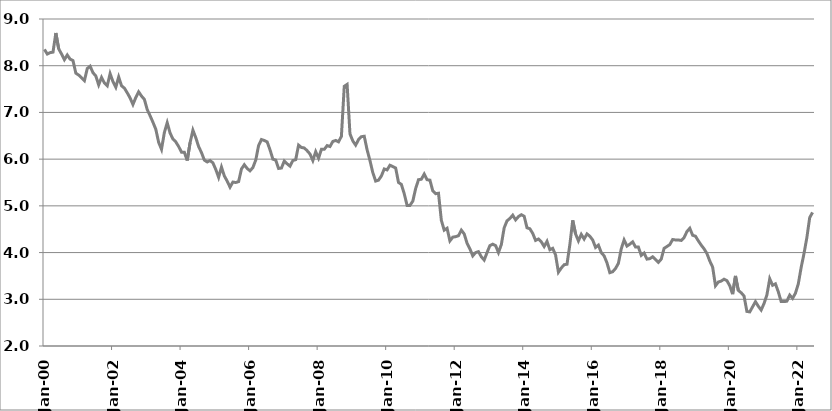
| Category | Series 1 |
|---|---|
| 2000-01-01 | 8.35 |
| 2000-02-01 | 8.25 |
| 2000-03-01 | 8.28 |
| 2000-04-01 | 8.29 |
| 2000-05-01 | 8.7 |
| 2000-06-01 | 8.36 |
| 2000-07-01 | 8.25 |
| 2000-08-01 | 8.13 |
| 2000-09-01 | 8.23 |
| 2000-10-01 | 8.14 |
| 2000-11-01 | 8.11 |
| 2000-12-01 | 7.84 |
| 2001-01-01 | 7.8 |
| 2001-02-01 | 7.74 |
| 2001-03-01 | 7.68 |
| 2001-04-01 | 7.94 |
| 2001-05-01 | 7.99 |
| 2001-06-01 | 7.85 |
| 2001-07-01 | 7.78 |
| 2001-08-01 | 7.59 |
| 2001-09-01 | 7.75 |
| 2001-10-01 | 7.63 |
| 2001-11-01 | 7.57 |
| 2001-12-01 | 7.83 |
| 2002-01-01 | 7.66 |
| 2002-02-01 | 7.54 |
| 2002-03-01 | 7.76 |
| 2002-04-01 | 7.57 |
| 2002-05-01 | 7.52 |
| 2002-06-01 | 7.42 |
| 2002-07-01 | 7.31 |
| 2002-08-01 | 7.17 |
| 2002-09-01 | 7.32 |
| 2002-10-01 | 7.44 |
| 2002-11-01 | 7.35 |
| 2002-12-01 | 7.28 |
| 2003-01-01 | 7.06 |
| 2003-02-01 | 6.93 |
| 2003-03-01 | 6.79 |
| 2003-04-01 | 6.64 |
| 2003-05-01 | 6.36 |
| 2003-06-01 | 6.21 |
| 2003-07-01 | 6.57 |
| 2003-08-01 | 6.78 |
| 2003-09-01 | 6.56 |
| 2003-10-01 | 6.43 |
| 2003-11-01 | 6.37 |
| 2003-12-01 | 6.27 |
| 2004-01-01 | 6.15 |
| 2004-02-01 | 6.15 |
| 2004-03-01 | 5.97 |
| 2004-04-01 | 6.35 |
| 2004-05-01 | 6.62 |
| 2004-06-01 | 6.46 |
| 2004-07-01 | 6.27 |
| 2004-08-01 | 6.14 |
| 2004-09-01 | 5.98 |
| 2004-10-01 | 5.94 |
| 2004-11-01 | 5.97 |
| 2004-12-01 | 5.92 |
| 2005-01-01 | 5.78 |
| 2005-02-01 | 5.61 |
| 2005-03-01 | 5.83 |
| 2005-04-01 | 5.64 |
| 2005-05-01 | 5.53 |
| 2005-06-01 | 5.4 |
| 2005-07-01 | 5.51 |
| 2005-08-01 | 5.5 |
| 2005-09-01 | 5.52 |
| 2005-10-01 | 5.79 |
| 2005-11-01 | 5.88 |
| 2005-12-01 | 5.8 |
| 2006-01-01 | 5.75 |
| 2006-02-01 | 5.82 |
| 2006-03-01 | 5.98 |
| 2006-04-01 | 6.29 |
| 2006-05-01 | 6.42 |
| 2006-06-01 | 6.4 |
| 2006-07-01 | 6.37 |
| 2006-08-01 | 6.2 |
| 2006-09-01 | 6 |
| 2006-10-01 | 5.98 |
| 2006-11-01 | 5.8 |
| 2006-12-01 | 5.81 |
| 2007-01-01 | 5.96 |
| 2007-02-01 | 5.9 |
| 2007-03-01 | 5.85 |
| 2007-04-01 | 5.97 |
| 2007-05-01 | 5.99 |
| 2007-06-01 | 6.3 |
| 2007-07-01 | 6.25 |
| 2007-08-01 | 6.24 |
| 2007-09-01 | 6.18 |
| 2007-10-01 | 6.11 |
| 2007-11-01 | 5.97 |
| 2007-12-01 | 6.16 |
| 2008-01-01 | 6.02 |
| 2008-02-01 | 6.21 |
| 2008-03-01 | 6.21 |
| 2008-04-01 | 6.29 |
| 2008-05-01 | 6.27 |
| 2008-06-01 | 6.38 |
| 2008-07-01 | 6.4 |
| 2008-08-01 | 6.37 |
| 2008-09-01 | 6.49 |
| 2008-10-01 | 7.56 |
| 2008-11-01 | 7.6 |
| 2008-12-01 | 6.54 |
| 2009-01-01 | 6.39 |
| 2009-02-01 | 6.3 |
| 2009-03-01 | 6.42 |
| 2009-04-01 | 6.48 |
| 2009-05-01 | 6.49 |
| 2009-06-01 | 6.2 |
| 2009-07-01 | 5.97 |
| 2009-08-01 | 5.71 |
| 2009-09-01 | 5.53 |
| 2009-10-01 | 5.55 |
| 2009-11-01 | 5.64 |
| 2009-12-01 | 5.79 |
| 2010-01-01 | 5.77 |
| 2010-02-01 | 5.87 |
| 2010-03-01 | 5.84 |
| 2010-04-01 | 5.81 |
| 2010-05-01 | 5.5 |
| 2010-06-01 | 5.46 |
| 2010-07-01 | 5.26 |
| 2010-08-01 | 5.01 |
| 2010-09-01 | 5.01 |
| 2010-10-01 | 5.1 |
| 2010-11-01 | 5.37 |
| 2010-12-01 | 5.56 |
| 2011-01-01 | 5.57 |
| 2011-02-01 | 5.68 |
| 2011-03-01 | 5.56 |
| 2011-04-01 | 5.55 |
| 2011-05-01 | 5.32 |
| 2011-06-01 | 5.26 |
| 2011-07-01 | 5.27 |
| 2011-08-01 | 4.69 |
| 2011-09-01 | 4.48 |
| 2011-10-01 | 4.52 |
| 2011-11-01 | 4.25 |
| 2011-12-01 | 4.33 |
| 2012-01-01 | 4.34 |
| 2012-02-01 | 4.36 |
| 2012-03-01 | 4.48 |
| 2012-04-01 | 4.4 |
| 2012-05-01 | 4.2 |
| 2012-06-01 | 4.08 |
| 2012-07-01 | 3.93 |
| 2012-08-01 | 4 |
| 2012-09-01 | 4.02 |
| 2012-10-01 | 3.91 |
| 2012-11-01 | 3.84 |
| 2012-12-01 | 4 |
| 2013-01-01 | 4.15 |
| 2013-02-01 | 4.18 |
| 2013-03-01 | 4.15 |
| 2013-04-01 | 4 |
| 2013-05-01 | 4.17 |
| 2013-06-01 | 4.53 |
| 2013-07-01 | 4.68 |
| 2013-08-01 | 4.73 |
| 2013-09-01 | 4.8 |
| 2013-10-01 | 4.7 |
| 2013-11-01 | 4.77 |
| 2013-12-01 | 4.81 |
| 2014-01-01 | 4.778 |
| 2014-02-01 | 4.53 |
| 2014-03-01 | 4.51 |
| 2014-04-01 | 4.41 |
| 2014-05-01 | 4.26 |
| 2014-06-01 | 4.29 |
| 2014-07-01 | 4.23 |
| 2014-08-01 | 4.13 |
| 2014-09-01 | 4.24 |
| 2014-10-01 | 4.06 |
| 2014-11-01 | 4.09 |
| 2014-12-01 | 3.95 |
| 2015-01-01 | 3.58 |
| 2015-02-01 | 3.67 |
| 2015-03-01 | 3.74 |
| 2015-04-01 | 3.75 |
| 2015-05-01 | 4.17 |
| 2015-06-01 | 4.69 |
| 2015-07-01 | 4.4 |
| 2015-08-01 | 4.25 |
| 2015-09-01 | 4.39 |
| 2015-10-01 | 4.29 |
| 2015-11-01 | 4.4 |
| 2015-12-01 | 4.35 |
| 2016-01-01 | 4.27 |
| 2016-02-01 | 4.11 |
| 2016-03-01 | 4.16 |
| 2016-04-01 | 4 |
| 2016-05-01 | 3.93 |
| 2016-06-01 | 3.78 |
| 2016-07-01 | 3.57 |
| 2016-08-01 | 3.59 |
| 2016-09-01 | 3.66 |
| 2016-10-01 | 3.77 |
| 2016-11-01 | 4.08 |
| 2016-12-01 | 4.27 |
| 2017-01-01 | 4.14 |
| 2017-02-01 | 4.18 |
| 2017-03-01 | 4.23 |
| 2017-04-01 | 4.12 |
| 2017-05-01 | 4.12 |
| 2017-06-01 | 3.94 |
| 2017-07-01 | 3.99 |
| 2017-08-01 | 3.86 |
| 2017-09-01 | 3.87 |
| 2017-10-01 | 3.91 |
| 2017-11-01 | 3.85 |
| 2017-12-01 | 3.79 |
| 2018-01-01 | 3.86 |
| 2018-02-01 | 4.09 |
| 2018-03-01 | 4.13 |
| 2018-04-01 | 4.17 |
| 2018-05-01 | 4.28 |
| 2018-06-01 | 4.27 |
| 2018-07-01 | 4.27 |
| 2018-08-01 | 4.26 |
| 2018-09-01 | 4.32 |
| 2018-10-01 | 4.45 |
| 2018-11-01 | 4.52 |
| 2018-12-01 | 4.37 |
| 2019-01-01 | 4.35 |
| 2019-02-01 | 4.25 |
| 2019-03-01 | 4.16 |
| 2019-04-01 | 4.08 |
| 2019-05-01 | 3.98 |
| 2019-06-01 | 3.82 |
| 2019-07-01 | 3.69 |
| 2019-08-01 | 3.29 |
| 2019-09-01 | 3.37 |
| 2019-10-01 | 3.39 |
| 2019-11-01 | 3.43 |
| 2019-12-01 | 3.4 |
| 2020-01-01 | 3.29 |
| 2020-02-01 | 3.11 |
| 2020-03-01 | 3.5 |
| 2020-04-01 | 3.19 |
| 2020-05-01 | 3.14 |
| 2020-06-01 | 3.07 |
| 2020-07-01 | 2.74 |
| 2020-08-01 | 2.73 |
| 2020-09-01 | 2.84 |
| 2020-10-01 | 2.95 |
| 2020-11-01 | 2.85 |
| 2020-12-01 | 2.77 |
| 2021-01-01 | 2.91 |
| 2021-02-01 | 3.09 |
| 2021-03-01 | 3.44 |
| 2021-04-01 | 3.3 |
| 2021-05-01 | 3.33 |
| 2021-06-01 | 3.16 |
| 2021-07-01 | 2.95 |
| 2021-08-01 | 2.95 |
| 2021-09-01 | 2.96 |
| 2021-10-01 | 3.09 |
| 2021-11-01 | 3.02 |
| 2021-12-01 | 3.13 |
| 2022-01-01 | 3.33 |
| 2022-02-01 | 3.68 |
| 2022-03-01 | 3.98 |
| 2022-04-01 | 4.32 |
| 2022-05-01 | 4.75 |
| 2022-06-01 | 4.86 |